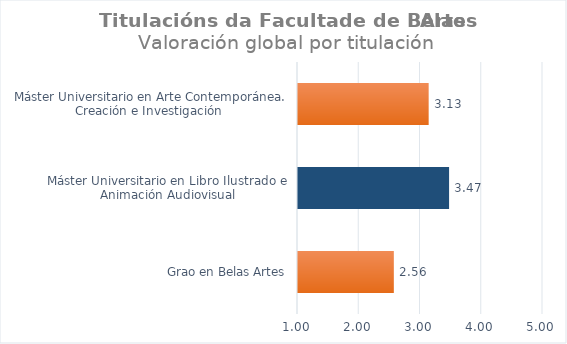
| Category | Series 0 |
|---|---|
| Grao en Belas Artes | 2.565 |
| Máster Universitario en Libro Ilustrado e Animación Audiovisual | 3.467 |
| Máster Universitario en Arte Contemporánea. Creación e Investigación  | 3.133 |